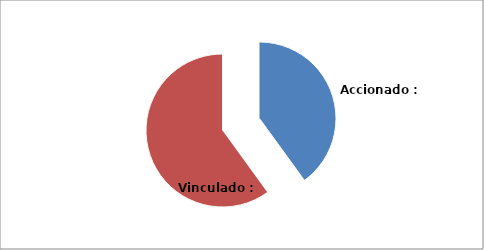
| Category | Series 0 |
|---|---|
| Accionado : 7 | 2 |
| Vinculado : 4 | 3 |